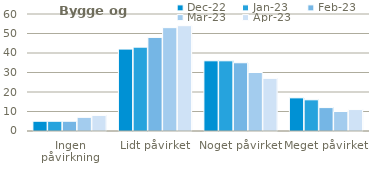
| Category | dec-22 | jan-23 | feb-23 | mar-23 | apr-23 |
|---|---|---|---|---|---|
| Ingen påvirkning | 5 | 5 | 5 | 7 | 8 |
| Lidt påvirket | 42 | 43 | 48 | 53 | 54 |
| Noget påvirket | 36 | 36 | 35 | 30 | 27 |
| Meget påvirket | 17 | 16 | 12 | 10 | 11 |